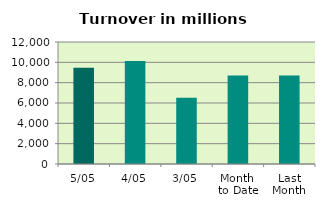
| Category | Series 0 |
|---|---|
| 5/05 | 9464.456 |
| 4/05 | 10139.685 |
| 3/05 | 6509.626 |
| Month 
to Date | 8704.589 |
| Last
Month | 8713.977 |